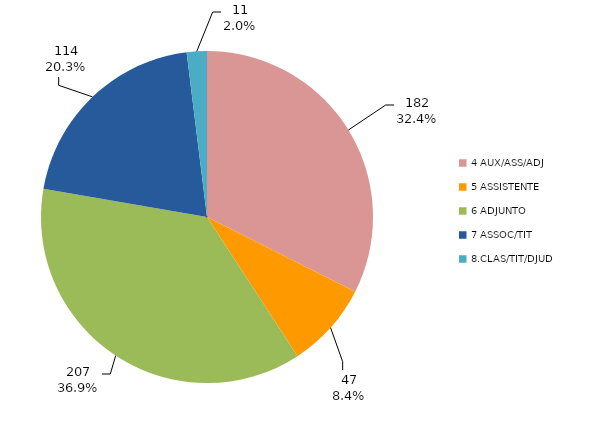
| Category | 2016 |
|---|---|
| 4 AUX/ASS/ADJ | 182 |
| 5 ASSISTENTE | 47 |
| 6 ADJUNTO | 207 |
| 7 ASSOC/TIT | 114 |
| 8.CLAS/TIT/DJUD | 11 |